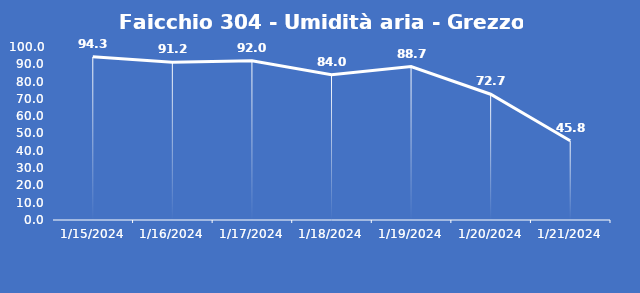
| Category | Faicchio 304 - Umidità aria - Grezzo (%) |
|---|---|
| 1/15/24 | 94.3 |
| 1/16/24 | 91.2 |
| 1/17/24 | 92 |
| 1/18/24 | 84 |
| 1/19/24 | 88.7 |
| 1/20/24 | 72.7 |
| 1/21/24 | 45.8 |